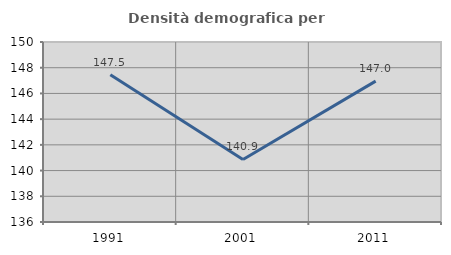
| Category | Densità demografica |
|---|---|
| 1991.0 | 147.458 |
| 2001.0 | 140.867 |
| 2011.0 | 146.957 |